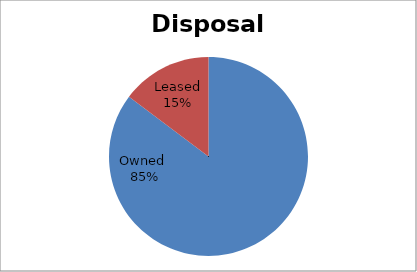
| Category | Series 0 |
|---|---|
| Owned  | 20176 |
| Leased | 3487 |